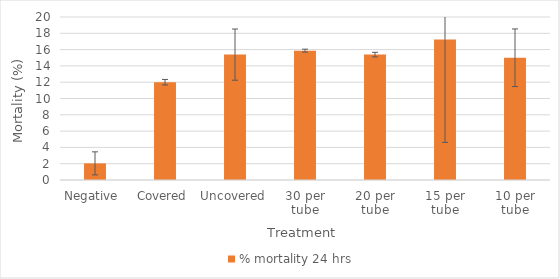
| Category | % mortality 24 hrs |
|---|---|
| Negative  | 2.041 |
| Covered | 12 |
| Uncovered | 15.385 |
| 30 per tube | 15.873 |
| 20 per tube | 15.385 |
| 15 per tube | 17.241 |
| 10 per tube | 15 |